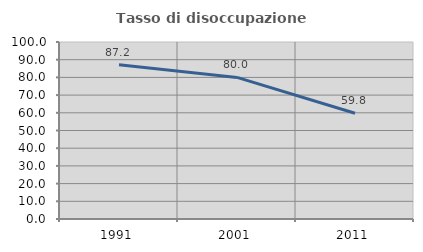
| Category | Tasso di disoccupazione giovanile  |
|---|---|
| 1991.0 | 87.162 |
| 2001.0 | 80 |
| 2011.0 | 59.756 |